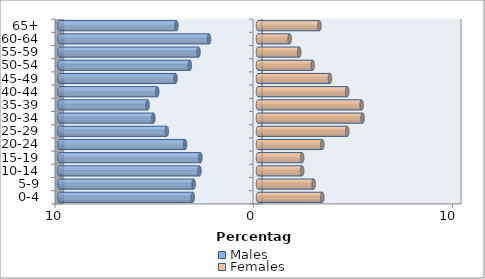
| Category | Males | Females |
|---|---|---|
| 0-4 | -3.285 | 3.237 |
| 5-9 | -3.237 | 2.802 |
| 10-14 | -2.947 | 2.222 |
| 15-19 | -2.899 | 2.222 |
| 20-24 | -3.671 | 3.237 |
| 25-29 | -4.589 | 4.493 |
| 30-34 | -5.266 | 5.266 |
| 35-39 | -5.556 | 5.217 |
| 40-44 | -5.072 | 4.493 |
| 45-49 | -4.155 | 3.623 |
| 50-54 | -3.43 | 2.754 |
| 55-59 | -2.995 | 2.077 |
| 60-64 | -2.464 | 1.594 |
| 65+ | -4.106 | 3.092 |